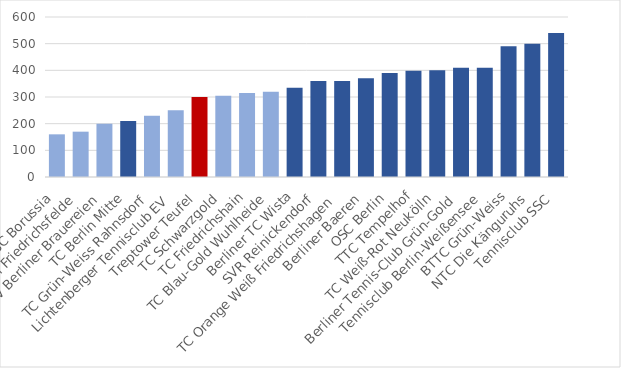
| Category | Mitgliesbeitrag |
|---|---|
| SC Borussia | 160 |
| TC Rotation Friedrichsfelde | 170 |
| SV Berliner Brauereien | 200 |
| TC Berlin Mitte | 210 |
| TC Grün-Weiss Rahnsdorf | 230 |
| Lichtenberger Tennisclub EV | 250 |
| Treptower Teufel | 300 |
| TC Schwarzgold | 305 |
| TC Friedrichshain | 315 |
| TC Blau-Gold Wuhlheide | 320 |
| Berliner TC Wista | 335 |
| SVR Reinickendorf | 360 |
| TC Orange Weiß Friedrichshagen | 360 |
| Berliner Baeren | 370 |
| OSC Berlin | 390 |
| TTC Tempelhof | 398 |
| TC Weiß-Rot Neukölln | 400 |
| Berliner Tennis-Club Grün-Gold | 410 |
| Tennisclub Berlin-Weißensee | 410 |
| BTTC Grün-Weiss | 490 |
| NTC Die Känguruhs | 500 |
| Tennisclub SSC | 540 |